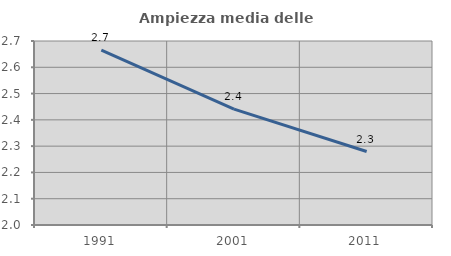
| Category | Ampiezza media delle famiglie |
|---|---|
| 1991.0 | 2.665 |
| 2001.0 | 2.441 |
| 2011.0 | 2.279 |